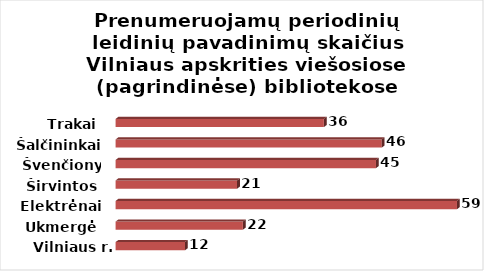
| Category | Series 0 |
|---|---|
| Vilniaus r. | 12 |
| Ukmergė | 22 |
| Elektrėnai | 59 |
| Širvintos | 21 |
| Švenčionys | 45 |
| Šalčininkai | 46 |
| Trakai | 36 |